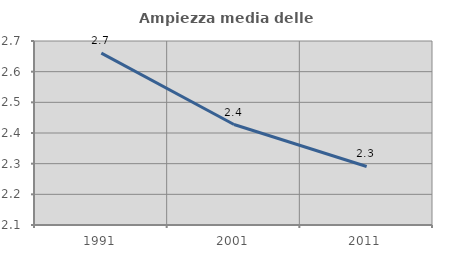
| Category | Ampiezza media delle famiglie |
|---|---|
| 1991.0 | 2.661 |
| 2001.0 | 2.428 |
| 2011.0 | 2.291 |